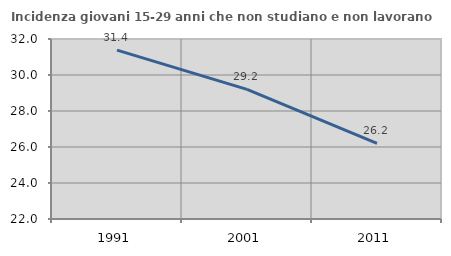
| Category | Incidenza giovani 15-29 anni che non studiano e non lavorano  |
|---|---|
| 1991.0 | 31.382 |
| 2001.0 | 29.204 |
| 2011.0 | 26.197 |